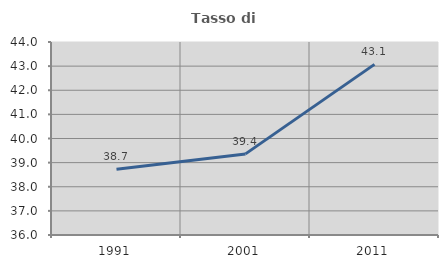
| Category | Tasso di occupazione   |
|---|---|
| 1991.0 | 38.729 |
| 2001.0 | 39.362 |
| 2011.0 | 43.072 |